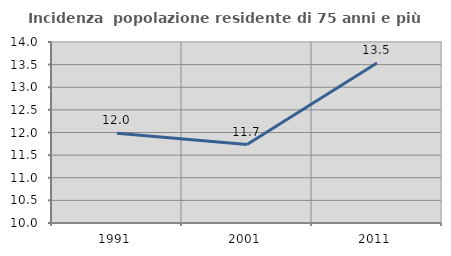
| Category | Incidenza  popolazione residente di 75 anni e più |
|---|---|
| 1991.0 | 11.984 |
| 2001.0 | 11.734 |
| 2011.0 | 13.538 |